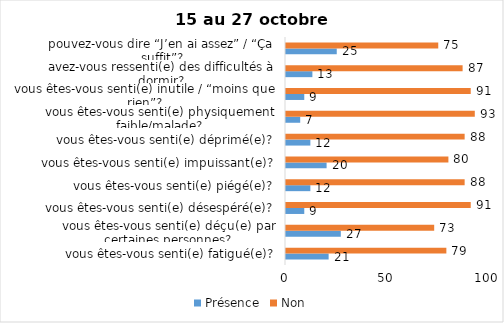
| Category | Présence | Non |
|---|---|---|
| vous êtes-vous senti(e) fatigué(e)? | 21 | 79 |
| vous êtes-vous senti(e) déçu(e) par certaines personnes? | 27 | 73 |
| vous êtes-vous senti(e) désespéré(e)? | 9 | 91 |
| vous êtes-vous senti(e) piégé(e)? | 12 | 88 |
| vous êtes-vous senti(e) impuissant(e)? | 20 | 80 |
| vous êtes-vous senti(e) déprimé(e)? | 12 | 88 |
| vous êtes-vous senti(e) physiquement faible/malade? | 7 | 93 |
| vous êtes-vous senti(e) inutile / “moins que rien”? | 9 | 91 |
| avez-vous ressenti(e) des difficultés à dormir? | 13 | 87 |
| pouvez-vous dire “J’en ai assez” / “Ça suffit”? | 25 | 75 |